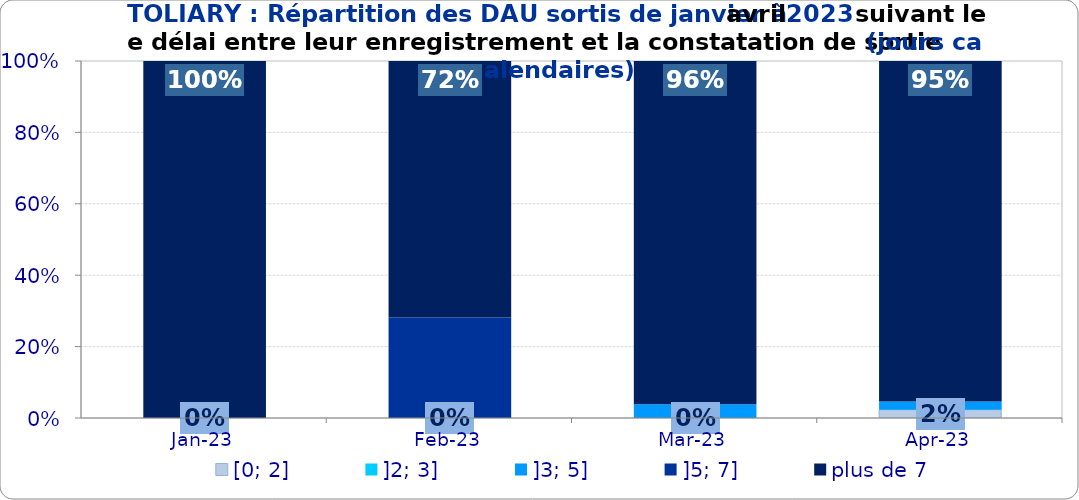
| Category | [0; 2] | ]2; 3] | ]3; 5] | ]5; 7] | plus de 7 |
|---|---|---|---|---|---|
| 2023-01-01 | 0 | 0 | 0 | 0 | 1 |
| 2023-02-01 | 0 | 0 | 0 | 0.281 | 0.719 |
| 2023-03-01 | 0 | 0 | 0.038 | 0 | 0.962 |
| 2023-04-01 | 0.023 | 0 | 0.023 | 0 | 0.953 |